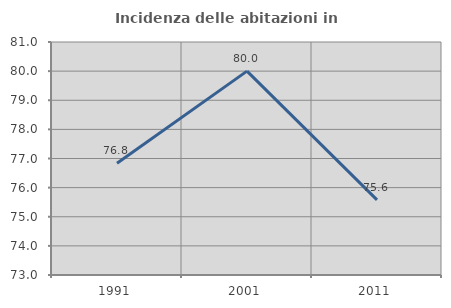
| Category | Incidenza delle abitazioni in proprietà  |
|---|---|
| 1991.0 | 76.836 |
| 2001.0 | 80 |
| 2011.0 | 75.581 |